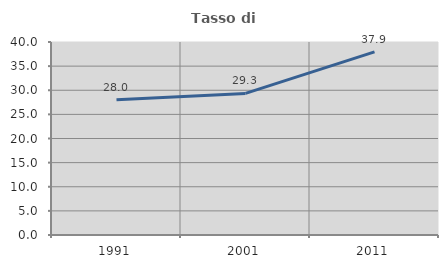
| Category | Tasso di occupazione   |
|---|---|
| 1991.0 | 28.028 |
| 2001.0 | 29.344 |
| 2011.0 | 37.945 |